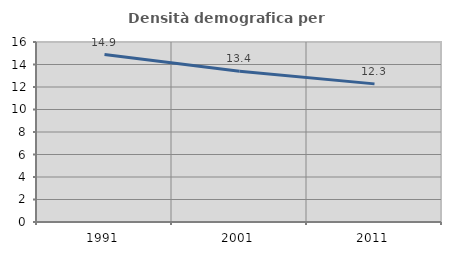
| Category | Densità demografica |
|---|---|
| 1991.0 | 14.885 |
| 2001.0 | 13.399 |
| 2011.0 | 12.277 |